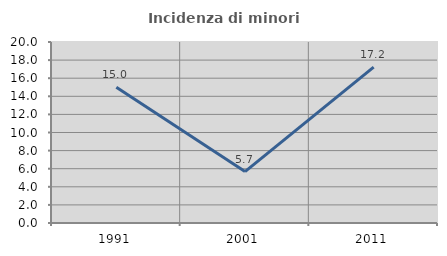
| Category | Incidenza di minori stranieri |
|---|---|
| 1991.0 | 15 |
| 2001.0 | 5.682 |
| 2011.0 | 17.231 |